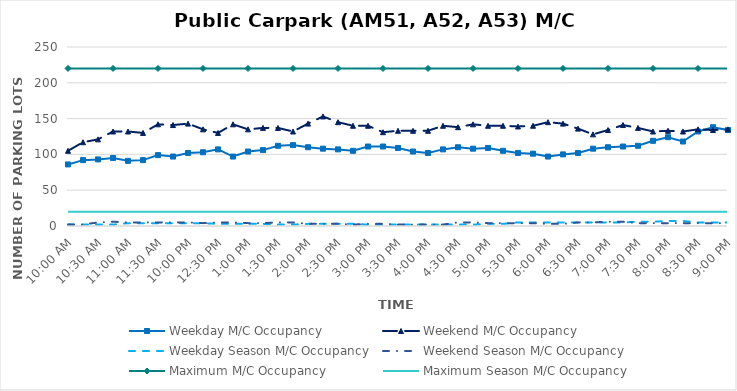
| Category | Weekday M/C Occupancy | Weekend M/C Occupancy | Weekday Season M/C Occupancy | Weekend Season M/C Occupancy | Maximum M/C Occupancy | Maximum Season M/C Occupancy |
|---|---|---|---|---|---|---|
| 0.4166666666666667 | 86 | 105 | 2 | 2 | 220 | 20 |
| 0.4270833333333333 | 92 | 117 | 2 | 2 | 220 | 20 |
| 0.4375 | 93 | 121 | 2 | 5 | 220 | 20 |
| 0.4479166666666667 | 95 | 132 | 2 | 6 | 220 | 20 |
| 0.4583333333333333 | 91 | 132 | 4 | 5 | 220 | 20 |
| 0.46875 | 92 | 130 | 4 | 5 | 220 | 20 |
| 0.4791666666666667 | 99 | 142 | 4 | 5 | 220 | 20 |
| 0.4895833333333333 | 97 | 141 | 4 | 5 | 220 | 20 |
| 0.5 | 102 | 143 | 4 | 5 | 220 | 20 |
| 0.5104166666666666 | 103 | 135 | 4 | 4 | 220 | 20 |
| 0.5208333333333334 | 107 | 130 | 3 | 5 | 220 | 20 |
| 0.53125 | 97 | 142 | 3 | 5 | 220 | 20 |
| 0.5416666666666666 | 104 | 135 | 3 | 4 | 220 | 20 |
| 0.5520833333333334 | 106 | 137 | 3 | 4 | 220 | 20 |
| 0.5625 | 112 | 137 | 2 | 5 | 220 | 20 |
| 0.5729166666666666 | 113 | 132 | 2 | 5 | 220 | 20 |
| 0.5833333333333334 | 110 | 143 | 3 | 3 | 220 | 20 |
| 0.59375 | 108 | 153 | 3 | 3 | 220 | 20 |
| 0.604166666666667 | 107 | 145 | 3 | 3 | 220 | 20 |
| 0.614583333333333 | 105 | 140 | 3 | 2 | 220 | 20 |
| 0.625 | 111 | 140 | 2 | 3 | 220 | 20 |
| 0.635416666666666 | 111 | 131 | 2 | 3 | 220 | 20 |
| 0.645833333333333 | 109 | 133 | 2 | 2 | 220 | 20 |
| 0.65625 | 104 | 133 | 2 | 2 | 220 | 20 |
| 0.666666666666666 | 102 | 133 | 2 | 2 | 220 | 20 |
| 0.677083333333333 | 107 | 140 | 2 | 2 | 220 | 20 |
| 0.6875 | 110 | 138 | 2 | 5 | 220 | 20 |
| 0.697916666666666 | 108 | 142 | 2 | 5 | 220 | 20 |
| 0.708333333333333 | 109 | 140 | 3 | 4 | 220 | 20 |
| 0.718749999999999 | 105 | 140 | 3 | 4 | 220 | 20 |
| 0.729166666666666 | 102 | 139 | 5 | 4 | 220 | 20 |
| 0.739583333333333 | 101 | 140 | 5 | 4 | 220 | 20 |
| 0.75 | 97 | 145 | 5 | 3 | 220 | 20 |
| 0.7604166666666666 | 100 | 143 | 5 | 3 | 220 | 20 |
| 0.7708333333333334 | 102 | 136 | 5 | 5 | 220 | 20 |
| 0.78125 | 108 | 128 | 5 | 5 | 220 | 20 |
| 0.7916666666666666 | 110 | 134 | 5 | 6 | 220 | 20 |
| 0.8020833333333334 | 111 | 141 | 5 | 6 | 220 | 20 |
| 0.8125 | 112 | 137 | 6 | 4 | 220 | 20 |
| 0.8229166666666666 | 119 | 132 | 6 | 4 | 220 | 20 |
| 0.8333333333333334 | 124 | 133 | 7 | 4 | 220 | 20 |
| 0.84375 | 118 | 132 | 7 | 4 | 220 | 20 |
| 0.8541666666666666 | 132 | 135 | 5 | 4 | 220 | 20 |
| 0.8645833333333334 | 138 | 134 | 5 | 4 | 220 | 20 |
| 0.875 | 134 | 135 | 5 | 4 | 220 | 20 |